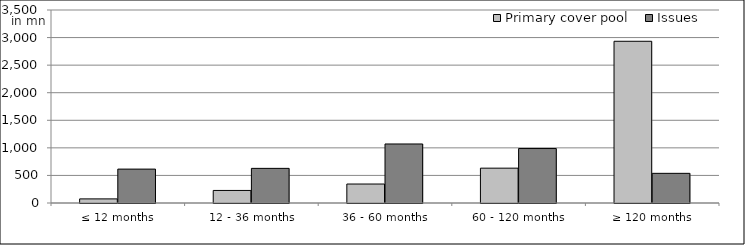
| Category | Primary cover pool | Issues |
|---|---|---|
| ≤ 12 months | 74570067.08 | 614718528.474 |
| 12 - 36 months | 227793151.44 | 628101644.14 |
| 36 - 60 months | 344135526.199 | 1070500000 |
| 60 - 120 months | 631848046.36 | 987650000 |
| ≥ 120 months | 2932980924.675 | 537860378.92 |